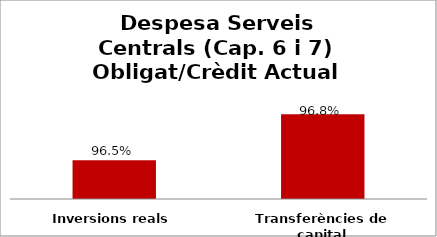
| Category | Series 0 |
|---|---|
| Inversions reals | 0.965 |
| Transferències de capital | 0.968 |